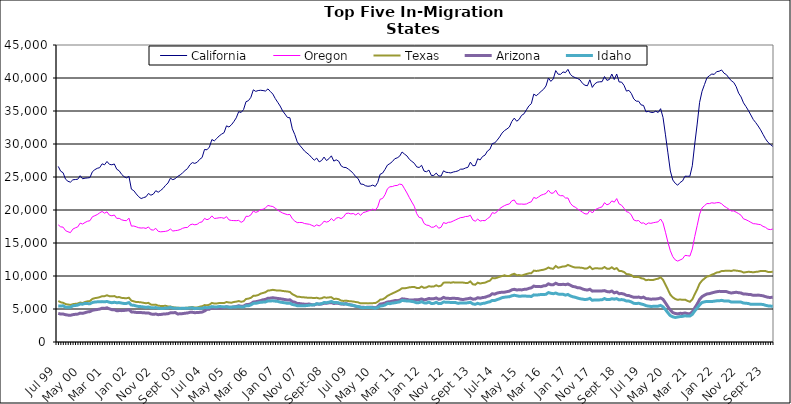
| Category |  California  |  Oregon  |  Texas  |  Arizona  |  Idaho  |
|---|---|---|---|---|---|
| Jul 99 | 26605 | 17749 | 6209 | 4339 | 5471 |
| Aug 99 | 25882 | 17447 | 6022 | 4228 | 5444 |
| Sep 99 | 25644 | 17401 | 5941 | 4237 | 5488 |
| Oct 99 | 24669 | 16875 | 5751 | 4134 | 5279 |
| Nov 99 | 24353 | 16701 | 5680 | 4073 | 5260 |
| Dec 99 | 24218 | 16570 | 5619 | 4042 | 5269 |
| Jan 00 | 24574 | 17109 | 5736 | 4142 | 5485 |
| Feb 00 | 24620 | 17295 | 5789 | 4192 | 5530 |
| Mar 00 | 24655 | 17436 | 5826 | 4226 | 5590 |
| Apr 00 | 25195 | 18009 | 5980 | 4375 | 5748 |
| May 00 | 24730 | 17875 | 5897 | 4337 | 5729 |
| Jun 00 | 24825 | 18113 | 6070 | 4444 | 5853 |
| Jul 00 | 24857 | 18294 | 6163 | 4555 | 5824 |
| Aug 00 | 24913 | 18376 | 6199 | 4603 | 5788 |
| Sep 00 | 25792 | 18971 | 6529 | 4804 | 5976 |
| Oct 00 | 26106 | 19135 | 6643 | 4870 | 6058 |
| Nov 00 | 26315 | 19306 | 6705 | 4926 | 6085 |
| Dec 00 | 26415 | 19570 | 6793 | 4991 | 6096 |
| Jan 01 | 26995 | 19781 | 6942 | 5122 | 6119 |
| Feb 01 | 26851 | 19519 | 6948 | 5089 | 6090 |
| Mar 01 | 27352 | 19720 | 7080 | 5180 | 6143 |
| Apr 01 | 26918 | 19221 | 6943 | 5020 | 6020 |
| May 01 | 26848 | 19126 | 6924 | 4899 | 5950 |
| Jun 01 | 26974 | 19241 | 6959 | 4895 | 6019 |
| Jul 01 | 26172 | 18725 | 6778 | 4737 | 5951 |
| Aug 01 | 25943 | 18736 | 6810 | 4757 | 5973 |
| Sep 01 | 25399 | 18514 | 6688 | 4753 | 5895 |
| Oct 01 | 25050 | 18415 | 6650 | 4780 | 5833 |
| Nov 01 | 24873 | 18381 | 6631 | 4826 | 5850 |
| Dec 01 | 25099 | 18765 | 6708 | 4898 | 5969 |
| Jan 02 | 23158 | 17561 | 6261 | 4560 | 5595 |
| Feb 02 | 22926 | 17573 | 6162 | 4531 | 5560 |
| Mar 02 | 22433 | 17452 | 6052 | 4481 | 5458 |
| Apr 02 | 22012 | 17314 | 6046 | 4458 | 5380 |
| May 02 | 21733 | 17267 | 6007 | 4452 | 5358 |
| Jun 02 | 21876 | 17298 | 5933 | 4444 | 5315 |
| Jul 02 | 21997 | 17209 | 5873 | 4383 | 5243 |
| Aug 02 | 22507 | 17436 | 5929 | 4407 | 5315 |
| Sep 02 | 22244 | 17010 | 5672 | 4248 | 5192 |
| Oct 02 | 22406 | 16952 | 5625 | 4191 | 5167 |
| Nov 02 | 22922 | 17223 | 5663 | 4242 | 5221 |
| Dec 02 | 22693 | 16770 | 5499 | 4142 | 5120 |
| Jan 03 | 22964 | 16694 | 5463 | 4166 | 5089 |
| Feb 03 | 23276 | 16727 | 5461 | 4226 | 5077 |
| Mar 03 | 23736 | 16766 | 5486 | 4251 | 5145 |
| Apr 03 | 24079 | 16859 | 5389 | 4289 | 5145 |
| May 03 | 24821 | 17117 | 5378 | 4415 | 5254 |
| Jun 03 | 24592 | 16812 | 5273 | 4426 | 5135 |
| Jul 03 | 24754 | 16875 | 5226 | 4466 | 5124 |
| Aug 03 | 25092 | 16922 | 5181 | 4244 | 5100 |
| Sep 03 | 25316 | 17036 | 5181 | 4279 | 5086 |
| Oct 03 | 25622 | 17228 | 5139 | 4301 | 5110 |
| Nov 03 | 25984 | 17335 | 5175 | 4362 | 5091 |
| Dec 03 | 26269 | 17350 | 5189 | 4396 | 5113 |
| Jan 04 | 26852 | 17734 | 5255 | 4492 | 5152 |
| Feb 04 | 27184 | 17860 | 5301 | 4502 | 5183 |
| Mar 04 | 27062 | 17757 | 5227 | 4443 | 5056 |
| Apr 04 | 27238 | 17840 | 5227 | 4461 | 5104 |
| May 04 | 27671 | 18113 | 5345 | 4493 | 5095 |
| Jun 04 | 27949 | 18201 | 5416 | 4532 | 5103 |
| Jul 04 | 29172 | 18727 | 5597 | 4697 | 5231 |
| Aug 04 | 29122 | 18529 | 5561 | 4945 | 5197 |
| Sep 04 | 29542 | 18678 | 5656 | 4976 | 5237 |
| Oct 04 | 30674 | 19108 | 5922 | 5188 | 5363 |
| Nov 04 | 30472 | 18716 | 5823 | 5106 | 5321 |
| Dec 04 | 30831 | 18755 | 5838 | 5135 | 5312 |
| Jan 05 | 31224 | 18823 | 5906 | 5155 | 5374 |
| Feb 05 | 31495 | 18842 | 5898 | 5168 | 5357 |
| Mar 05 | 31714 | 18738 | 5894 | 5212 | 5313 |
| Apr 05 | 32750 | 18998 | 6060 | 5340 | 5350 |
| May 05 | 32575 | 18504 | 5989 | 5269 | 5276 |
| Jun 05 | 32898 | 18414 | 5954 | 5252 | 5271 |
| Jul 05 | 33384 | 18395 | 6062 | 5322 | 5322 |
| Aug 05 | 33964 | 18381 | 6113 | 5375 | 5316 |
| Sep 05 | 34897 | 18426 | 6206 | 5493 | 5362 |
| Oct 05 | 34780 | 18132 | 6100 | 5408 | 5308 |
| Nov 05 | 35223 | 18332 | 6162 | 5434 | 5314 |
| Dec 05 | 36415 | 19047 | 6508 | 5658 | 5487 |
| Jan 06 | 36567 | 19032 | 6576 | 5688 | 5480 |
| Feb 06 | 37074 | 19257 | 6692 | 5792 | 5616 |
| Mar 06 | 38207 | 19845 | 6993 | 6052 | 5850 |
| Apr 06 | 37976 | 19637 | 7024 | 6101 | 5864 |
| May 06 | 38099 | 19781 | 7114 | 6178 | 5943 |
| Jun 06 | 38141 | 20061 | 7331 | 6276 | 6018 |
| Jul 06 | 38097 | 20111 | 7431 | 6399 | 6046 |
| Aug 06 | 38021 | 20333 | 7542 | 6450 | 6064 |
| Sep 06 | 38349 | 20686 | 7798 | 6627 | 6232 |
| Oct 06 | 37947 | 20591 | 7825 | 6647 | 6216 |
| Nov 06 | 37565 | 20526 | 7907 | 6707 | 6244 |
| Dec 06 | 36884 | 20272 | 7840 | 6648 | 6192 |
| Jan 07 | 36321 | 19984 | 7789 | 6597 | 6151 |
| Feb 07 | 35752 | 19752 | 7799 | 6554 | 6048 |
| Mar 07 | 35025 | 19547 | 7737 | 6487 | 5989 |
| Apr 07 | 34534 | 19412 | 7685 | 6430 | 5937 |
| May 07 | 34022 | 19296 | 7654 | 6353 | 5858 |
| Jun 07 | 33974 | 19318 | 7577 | 6390 | 5886 |
| Jul 07 | 32298 | 18677 | 7250 | 6117 | 5682 |
| Aug 07 | 31436 | 18322 | 7070 | 6034 | 5617 |
| Sep 07 | 30331 | 18087 | 6853 | 5847 | 5500 |
| Oct 07 | 29813 | 18108 | 6839 | 5821 | 5489 |
| Nov 07 | 29384 | 18105 | 6777 | 5769 | 5481 |
| Dec 07 | 28923 | 17949 | 6760 | 5733 | 5499 |
| Jan 08 | 28627 | 17890 | 6721 | 5732 | 5521 |
| Feb 08 | 28328 | 17834 | 6719 | 5749 | 5579 |
| Mar 08 | 27911 | 17680 | 6690 | 5650 | 5614 |
| Apr 08 | 27543 | 17512 | 6656 | 5612 | 5635 |
| May 08 | 27856 | 17754 | 6705 | 5774 | 5798 |
| Jun 08 | 27287 | 17589 | 6593 | 5717 | 5745 |
| Jul 08 | 27495 | 17834 | 6623 | 5761 | 5807 |
| Aug 08 | 28018 | 18309 | 6789 | 5867 | 5982 |
| Sep-08 | 27491 | 18164 | 6708 | 5864 | 5954 |
| Oct 08 | 27771 | 18291 | 6755 | 5942 | 6032 |
| Nov 08 | 28206 | 18706 | 6787 | 5970 | 6150 |
| Dec 08 | 27408 | 18353 | 6505 | 5832 | 5975 |
| Jan 09 | 27601 | 18778 | 6569 | 5890 | 5995 |
| Feb 09 | 27394 | 18863 | 6483 | 5845 | 5936 |
| Mar 09 | 26690 | 18694 | 6273 | 5751 | 5806 |
| Apr 09 | 26461 | 18943 | 6222 | 5735 | 5777 |
| May 09 | 26435 | 19470 | 6272 | 5819 | 5767 |
| Jun 09 | 26187 | 19522 | 6199 | 5700 | 5649 |
| Jul 09 | 25906 | 19408 | 6171 | 5603 | 5617 |
| Aug 09 | 25525 | 19469 | 6128 | 5533 | 5540 |
| Sep 09 | 25050 | 19249 | 6059 | 5405 | 5437 |
| Oct 09 | 24741 | 19529 | 6004 | 5349 | 5369 |
| Nov 09 | 23928 | 19187 | 5854 | 5271 | 5248 |
| Dec 09 | 23899 | 19607 | 5886 | 5261 | 5195 |
| Jan 10 | 23676 | 19703 | 5881 | 5232 | 5234 |
| Feb 10 | 23592 | 19845 | 5850 | 5272 | 5236 |
| Mar 10 | 23634 | 19946 | 5864 | 5278 | 5219 |
| Apr 10 | 23774 | 20134 | 5889 | 5257 | 5201 |
| May 10 | 23567 | 19966 | 5897 | 5172 | 5105 |
| Jun 10 | 24166 | 20464 | 6087 | 5356 | 5237 |
| Jul 10 | 25410 | 21627 | 6417 | 5742 | 5452 |
| Aug 10 | 25586 | 21744 | 6465 | 5797 | 5491 |
| Sep 10 | 26150 | 22314 | 6667 | 5907 | 5609 |
| Oct 10 | 26807 | 23219 | 6986 | 6070 | 5831 |
| Nov 10 | 27033 | 23520 | 7179 | 6100 | 5810 |
| Dec 10 | 27332 | 23551 | 7361 | 6182 | 5898 |
| Jan 11 | 27769 | 23697 | 7525 | 6276 | 5938 |
| Feb 11 | 27898 | 23718 | 7708 | 6267 | 6016 |
| Mar 11 | 28155 | 23921 | 7890 | 6330 | 6081 |
| Apr 11 | 28790 | 23847 | 8146 | 6544 | 6305 |
| May 11 | 28471 | 23215 | 8131 | 6502 | 6248 |
| Jun 11 | 28191 | 22580 | 8199 | 6445 | 6217 |
| Jul 11 | 27678 | 21867 | 8291 | 6368 | 6202 |
| Aug 11 | 27372 | 21203 | 8321 | 6356 | 6146 |
| Sep 11 | 27082 | 20570 | 8341 | 6387 | 6075 |
| Oct 11 | 26528 | 19442 | 8191 | 6402 | 5932 |
| Nov 11 | 26440 | 18872 | 8176 | 6426 | 5968 |
| Dec 11 | 26770 | 18784 | 8401 | 6533 | 6106 |
| Jan 12 | 25901 | 17963 | 8202 | 6390 | 5933 |
| Feb 12 | 25796 | 17718 | 8266 | 6456 | 5900 |
| Mar 12 | 26042 | 17647 | 8456 | 6600 | 6054 |
| Apr 12 | 25239 | 17386 | 8388 | 6534 | 5838 |
| May 12 | 25238 | 17407 | 8401 | 6558 | 5854 |
| Jun 12 | 25593 | 17673 | 8594 | 6669 | 6009 |
| Jul 12 | 25155 | 17237 | 8432 | 6474 | 5817 |
| Aug 12 | 25146 | 17391 | 8536 | 6539 | 5842 |
| Sep 12 | 25942 | 18102 | 8989 | 6759 | 6061 |
| Oct 12 | 25718 | 17953 | 9012 | 6618 | 6027 |
| Nov 12 | 25677 | 18134 | 9032 | 6611 | 6009 |
| Dec 12 | 25619 | 18166 | 8981 | 6601 | 5999 |
| Jan 13 | 25757 | 18344 | 9051 | 6627 | 5989 |
| Feb-13 | 25830 | 18512 | 9001 | 6606 | 5968 |
| Mar-13 | 25940 | 18689 | 9021 | 6577 | 5853 |
| Apr 13 | 26187 | 18844 | 9013 | 6478 | 5925 |
| May 13 | 26192 | 18884 | 9003 | 6431 | 5924 |
| Jun-13 | 26362 | 19013 | 8948 | 6508 | 5896 |
| Jul 13 | 26467 | 19037 | 8958 | 6559 | 5948 |
| Aug 13 | 27253 | 19198 | 9174 | 6655 | 6020 |
| Sep 13 | 26711 | 18501 | 8747 | 6489 | 5775 |
| Oct 13 | 26733 | 18301 | 8681 | 6511 | 5711 |
| Nov 13 | 27767 | 18620 | 8989 | 6709 | 5860 |
| Dec 13 | 27583 | 18320 | 8863 | 6637 | 5740 |
| Jan 14 | 28107 | 18409 | 8939 | 6735 | 5843 |
| Feb-14 | 28313 | 18383 | 8989 | 6779 | 5893 |
| Mar 14 | 28934 | 18696 | 9160 | 6918 | 6015 |
| Apr 14 | 29192 | 18946 | 9291 | 7036 | 6099 |
| May 14 | 30069 | 19603 | 9701 | 7314 | 6304 |
| Jun 14 | 30163 | 19487 | 9641 | 7252 | 6293 |
| Jul-14 | 30587 | 19754 | 9752 | 7415 | 6427 |
| Aug-14 | 31074 | 20201 | 9882 | 7499 | 6557 |
| Sep 14 | 31656 | 20459 | 9997 | 7536 | 6719 |
| Oct 14 | 32037 | 20663 | 10109 | 7555 | 6786 |
| Nov 14 | 32278 | 20825 | 9992 | 7628 | 6831 |
| Dec 14 | 32578 | 20918 | 10006 | 7705 | 6860 |
| Jan 15 | 33414 | 21396 | 10213 | 7906 | 7000 |
| Feb 15 | 33922 | 21518 | 10337 | 7982 | 7083 |
| Mar 15 | 33447 | 20942 | 10122 | 7891 | 7006 |
| Apr-15 | 33731 | 20893 | 10138 | 7906 | 6931 |
| May 15 | 34343 | 20902 | 10053 | 7895 | 6952 |
| Jun-15 | 34572 | 20870 | 10192 | 7973 | 6966 |
| Jul 15 | 35185 | 20916 | 10303 | 8000 | 6949 |
| Aug 15 | 35780 | 21115 | 10399 | 8126 | 6938 |
| Sep 15 | 36109 | 21246 | 10428 | 8207 | 6896 |
| Oct 15 | 37555 | 21908 | 10813 | 8477 | 7140 |
| Nov 15 | 37319 | 21750 | 10763 | 8390 | 7112 |
| Dec 15 | 37624 | 21990 | 10807 | 8395 | 7149 |
| Jan 16 | 37978 | 22248 | 10892 | 8388 | 7201 |
| Feb 16 | 38285 | 22369 | 10951 | 8508 | 7192 |
| Mar 16 | 38792 | 22506 | 11075 | 8547 | 7226 |
| Apr 16 | 39994 | 22999 | 11286 | 8815 | 7487 |
| May 16 | 39488 | 22548 | 11132 | 8673 | 7382 |
| Jun 16 | 39864 | 22556 | 11100 | 8682 | 7315 |
| Jul 16 | 41123 | 22989 | 11516 | 8903 | 7420 |
| Aug 16 | 40573 | 22333 | 11251 | 8731 | 7261 |
| Sep 16 | 40560 | 22162 | 11340 | 8692 | 7216 |
| Oct 16 | 40923 | 22172 | 11456 | 8742 | 7233 |
| Nov 16 | 40817 | 21818 | 11459 | 8685 | 7101 |
| Dec 16 | 41311 | 21815 | 11681 | 8783 | 7203 |
| Jan 17 | 40543 | 21029 | 11524 | 8609 | 6982 |
| Feb 17 | 40218 | 20613 | 11385 | 8416 | 6852 |
| Mar 17 | 40052 | 20425 | 11276 | 8354 | 6775 |
| Apr 17 | 39913 | 20147 | 11297 | 8218 | 6653 |
| May 17 | 39695 | 19910 | 11265 | 8196 | 6552 |
| Jun 17 | 39177 | 19650 | 11225 | 8034 | 6500 |
| Jul 17 | 38901 | 19419 | 11115 | 7923 | 6429 |
| Aug 17 | 38827 | 19389 | 11168 | 7867 | 6479 |
| Sep 17 | 39736 | 19936 | 11426 | 7991 | 6609 |
| Oct 17 | 38576 | 19547 | 11041 | 7708 | 6315 |
| Nov 17 | 39108 | 20013 | 11158 | 7746 | 6381 |
| Dec 17 | 39359 | 20202 | 11185 | 7743 | 6366 |
| Jan 18 | 39420 | 20362 | 11118 | 7736 | 6380 |
| Feb 18 | 39440 | 20476 | 11128 | 7741 | 6407 |
| Mar 18 | 40218 | 21106 | 11362 | 7789 | 6578 |
| Apr 18 | 39637 | 20788 | 11111 | 7642 | 6423 |
| May 18 | 39777 | 20933 | 11097 | 7591 | 6430 |
| Jun 18 | 40602 | 21381 | 11317 | 7721 | 6554 |
| Jul 18 | 39767 | 21189 | 11038 | 7445 | 6489 |
| Aug 18 | 40608 | 21729 | 11200 | 7560 | 6569 |
| Sep 18 | 39395 | 20916 | 10772 | 7318 | 6383 |
| Oct 18 | 39383 | 20724 | 10740 | 7344 | 6429 |
| Nov 18 | 38891 | 20265 | 10605 | 7255 | 6365 |
| Dec 18 | 38013 | 19741 | 10292 | 7069 | 6205 |
| Jan 19 | 38130 | 19643 | 10261 | 7032 | 6203 |
| Feb 19 | 37658 | 19237 | 10132 | 6892 | 6073 |
| Mar 19 | 36831 | 18492 | 9848 | 6766 | 5863 |
| Apr 19 | 36492 | 18349 | 9839 | 6763 | 5827 |
| May 19 | 36481 | 18407 | 9867 | 6809 | 5873 |
| Jun 19 | 35925 | 17998 | 9661 | 6698 | 5761 |
| Jul 19 | 35843 | 18049 | 9598 | 6800 | 5673 |
| Aug 19 | 34870 | 17785 | 9361 | 6577 | 5512 |
| Sep 19 | 34945 | 18038 | 9428 | 6547 | 5437 |
| Oct 19 | 34802 | 17977 | 9385 | 6483 | 5390 |
| Nov 19 | 34775 | 18072 | 9403 | 6511 | 5401 |
| Dec 19 | 34976 | 18140 | 9518 | 6521 | 5419 |
| Jan 20 | 34774 | 18209 | 9594 | 6561 | 5434 |
| Feb 20 | 35352 | 18632 | 9804 | 6682 | 5543 |
| Mar 20 | 34013 | 18041 | 9411 | 6464 | 5330 |
| Apr 20 | 31385 | 16629 | 8666 | 5922 | 4906 |
| May 20 | 28657 | 15123 | 7927 | 5355 | 4419 |
| Jun 20 | 25915 | 13817 | 7164 | 4815 | 3992 |
| Jul 20 | 24545 | 12926 | 6776 | 4457 | 3810 |
| Aug 20 | 24048 | 12443 | 6521 | 4326 | 3720 |
| Sep 20 | 23756 | 12258 | 6386 | 4266 | 3784 |
| Oct 20 | 24166 | 12429 | 6452 | 4347 | 3861 |
| Nov 20 | 24404 | 12597 | 6386 | 4324 | 3883 |
| Dec 20 | 25120 | 13122 | 6420 | 4394 | 3974 |
| Jan 21 | 25111 | 13080 | 6236 | 4304 | 3924 |
| Feb 21 | 25114 | 13015 | 6094 | 4260 | 3930 |
| Mar 21 | 26701 | 14096 | 6455 | 4567 | 4185 |
| Apr 21 | 29998 | 15978 | 7222 | 5164 | 4697 |
| May 21 | 33020 | 17641 | 7969 | 5748 | 5148 |
| Jun 21 | 36320 | 19369 | 8840 | 6450 | 5628 |
| Jul 21 | 37989 | 20320 | 9306 | 6877 | 5984 |
| Aug 21 | 39007 | 20657 | 9615 | 7094 | 6084 |
| Sep 21 | 40023 | 20974 | 9914 | 7277 | 6151 |
| Oct 21 | 40348 | 20966 | 10003 | 7327 | 6140 |
| Nov 21 | 40599 | 21096 | 10203 | 7437 | 6136 |
| Dec 21 | 40548 | 21032 | 10328 | 7532 | 6183 |
| Jan 22 | 40967 | 21106 | 10535 | 7618 | 6237 |
| Feb 22 | 41019 | 21125 | 10579 | 7673 | 6236 |
| Mar 22 | 41220 | 20949 | 10751 | 7660 | 6310 |
| Apr 22 | 40730 | 20602 | 10772 | 7661 | 6221 |
| May 22 | 40504 | 20370 | 10792 | 7636 | 6210 |
| Jun 22 | 40013 | 20127 | 10802 | 7504 | 6199 |
| Jul 22 | 39582 | 19846 | 10761 | 7419 | 6050 |
| Aug 22 | 39321 | 19865 | 10868 | 7487 | 6071 |
| Sep 22 | 38685 | 19666 | 10811 | 7536 | 6074 |
| Oct 22 | 37700 | 19450 | 10764 | 7469 | 6042 |
| Nov 22 | 37133 | 19198 | 10701 | 7425 | 6042 |
| Dec 22 | 36232 | 18659 | 10527 | 7261 | 5898 |
| Jan 23 | 35674 | 18528 | 10578 | 7263 | 5879 |
| Feb 23 | 35072 | 18344 | 10642 | 7211 | 5827 |
| Mar 23 | 34396 | 18133 | 10609 | 7183 | 5713 |
| Apr 23 | 33708 | 17931 | 10559 | 7074 | 5706 |
| May 23 | 33245 | 17904 | 10624 | 7091 | 5712 |
| Jun 23 | 32727 | 17831 | 10663 | 7105 | 5726 |
| Jul 23 | 32148 | 17773 | 10760 | 7058 | 5719 |
| Aug 23 | 31461 | 17513 | 10759 | 6999 | 5681 |
| Sep 23 | 30794 | 17376 | 10754 | 6882 | 5566 |
| Oct 23 | 30268 | 17096 | 10620 | 6775 | 5477 |
| Nov 23 | 29929 | 17029 | 10602 | 6746 | 5443 |
| Dec 23 | 29649 | 17114 | 10651 | 6787 | 5409 |